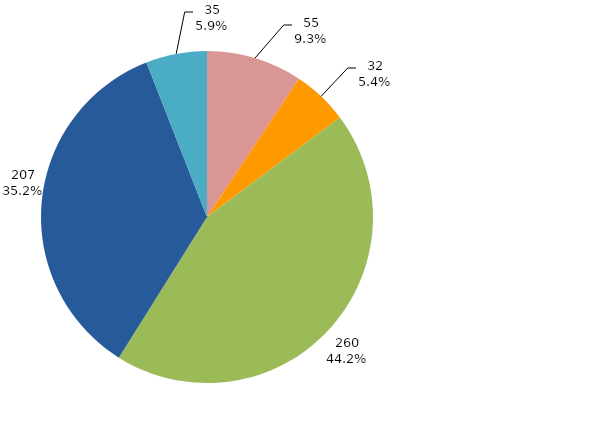
| Category | 2022 |
|---|---|
| 4 AUX/ASS/ADJ | 55 |
| 5 ASSISTENTE | 32 |
| 6 ADJUNTO | 260 |
| 7 ASSOC/TIT | 207 |
| 8.CLAS/TIT/DJUD | 35 |